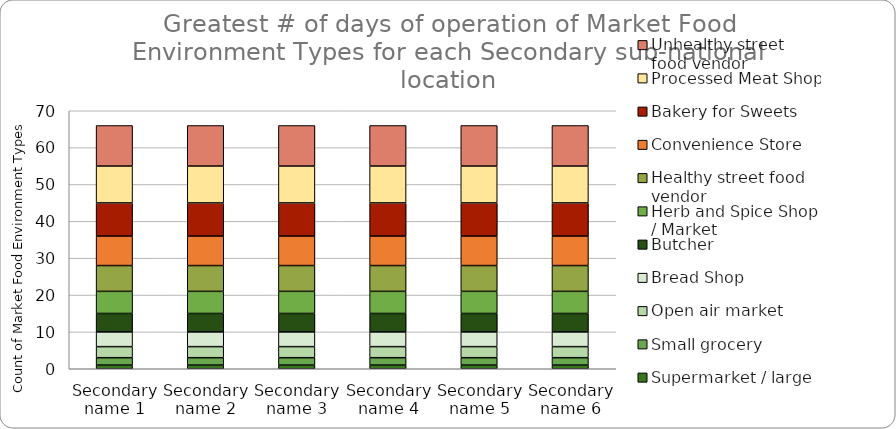
| Category | Supermarket / large grocery | Small grocery | Open air market | Bread Shop | Butcher | Herb and Spice Shop / Market | Healthy street food vendor | Convenience Store | Bakery for Sweets | Processed Meat Shop | Unhealthy street food vendor |
|---|---|---|---|---|---|---|---|---|---|---|---|
| Secondary name 1 | 1 | 2 | 3 | 4 | 5 | 6 | 7 | 8 | 9 | 10 | 11 |
| Secondary name 2 | 1 | 2 | 3 | 4 | 5 | 6 | 7 | 8 | 9 | 10 | 11 |
| Secondary name 3 | 1 | 2 | 3 | 4 | 5 | 6 | 7 | 8 | 9 | 10 | 11 |
| Secondary name 4 | 1 | 2 | 3 | 4 | 5 | 6 | 7 | 8 | 9 | 10 | 11 |
| Secondary name 5 | 1 | 2 | 3 | 4 | 5 | 6 | 7 | 8 | 9 | 10 | 11 |
| Secondary name 6 | 1 | 2 | 3 | 4 | 5 | 6 | 7 | 8 | 9 | 10 | 11 |